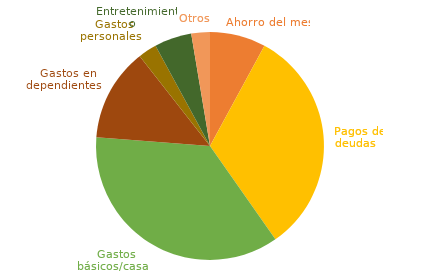
| Category | Series 0 |
|---|---|
|  Ahorro del mes  | 0.079 |
|  Pagos de deudas  | 0.323 |
|  Gastos básicos/casa  | 0.359 |
|  Gastos en dependientes  | 0.132 |
|  Gastos personales  | 0.026 |
|  Entretenimiento  | 0.053 |
|  Otros  | 0.026 |